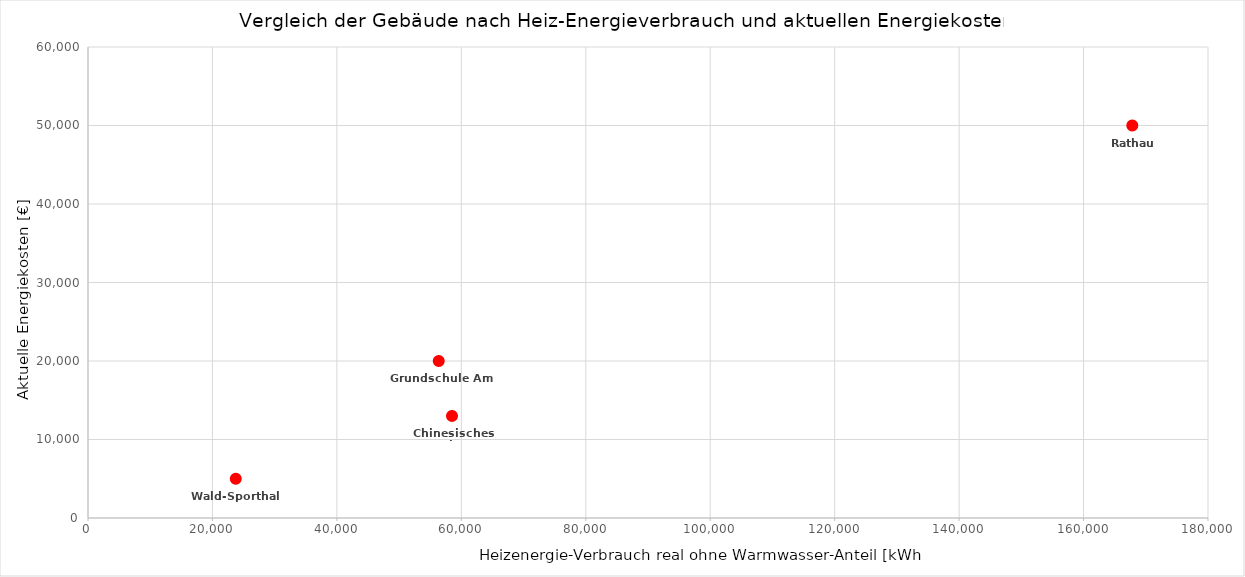
| Category | Optionales Feld für Diagramm: Aktuelle Heizenergie-Kosten pro Jahr [€] |
|---|---|
| 56366.666666666664 | 20000 |
| 167833.3333333333 | 50000 |
| 23750.0 | 5000 |
| 58500.0 | 13000 |
| 0.0 | 0 |
| 0.0 | 0 |
| 0.0 | 0 |
| 0.0 | 0 |
| 0.0 | 0 |
| 0.0 | 0 |
| 0.0 | 0 |
| 0.0 | 0 |
| 0.0 | 0 |
| 0.0 | 0 |
| 0.0 | 0 |
| 0.0 | 0 |
| 0.0 | 0 |
| 0.0 | 0 |
| 0.0 | 0 |
| 0.0 | 0 |
| 0.0 | 0 |
| 0.0 | 0 |
| 0.0 | 0 |
| 0.0 | 0 |
| 0.0 | 0 |
| 0.0 | 0 |
| 0.0 | 0 |
| 0.0 | 0 |
| 0.0 | 0 |
| 0.0 | 0 |